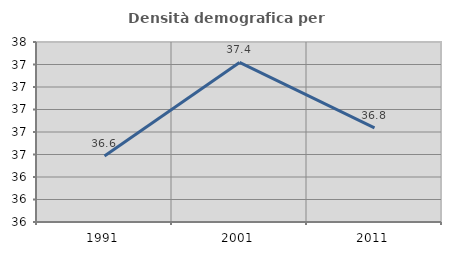
| Category | Densità demografica |
|---|---|
| 1991.0 | 36.587 |
| 2001.0 | 37.418 |
| 2011.0 | 36.836 |